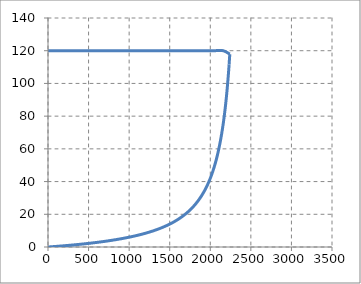
| Category | Series 0 |
|---|---|
| 0.0 | 120 |
| 120.0 | 120 |
| 240.0 | 120 |
| 360.0 | 120 |
| 480.0 | 120 |
| 600.0 | 120 |
| 720.0 | 120 |
| 840.0 | 120 |
| 960.0 | 120 |
| 1080.0 | 120 |
| 1200.0 | 120 |
| 1320.0 | 120 |
| 1440.0 | 120 |
| 1560.0 | 120 |
| 1680.0 | 120 |
| 1800.0 | 120 |
| 1920.0 | 120 |
| 2040.0 | 120 |
| 2160.0 | 120 |
| 2240.3999999999996 | 117.916 |
| 2232.0 | 111.6 |
| 2223.6 | 105.886 |
| 2215.2000000000003 | 100.691 |
| 2206.8 | 95.948 |
| 2198.3999999999996 | 91.6 |
| 2190.0 | 87.6 |
| 2181.6 | 83.908 |
| 2173.2000000000003 | 80.489 |
| 2164.8 | 77.314 |
| 2156.4 | 74.359 |
| 2148.0 | 71.6 |
| 2139.6 | 69.019 |
| 2131.2 | 66.6 |
| 2122.7999999999997 | 64.327 |
| 2114.4 | 62.188 |
| 2105.9999999999995 | 60.171 |
| 2097.6 | 58.267 |
| 2089.2 | 56.465 |
| 2080.7999999999997 | 54.758 |
| 2072.3999999999996 | 53.138 |
| 2064.0 | 51.6 |
| 2055.6 | 50.137 |
| 2047.1999999999998 | 48.743 |
| 2038.7999999999997 | 47.414 |
| 2030.4 | 46.145 |
| 2021.9999999999998 | 44.933 |
| 2013.6 | 43.774 |
| 2005.1999999999996 | 42.664 |
| 1996.7999999999997 | 41.6 |
| 1988.3999999999996 | 40.58 |
| 1980.0 | 39.6 |
| 1971.6 | 38.659 |
| 1963.2 | 37.754 |
| 1954.8 | 36.883 |
| 1946.3999999999996 | 36.044 |
| 1938.0 | 35.236 |
| 1929.6 | 34.457 |
| 1921.1999999999998 | 33.705 |
| 1912.7999999999997 | 32.979 |
| 1904.4 | 32.278 |
| 1895.9999999999998 | 31.6 |
| 1887.5999999999997 | 30.944 |
| 1879.2 | 30.31 |
| 1870.8 | 29.695 |
| 1862.3999999999999 | 29.1 |
| 1853.9999999999998 | 28.523 |
| 1845.6000000000001 | 27.964 |
| 1837.1999999999998 | 27.421 |
| 1828.8 | 26.894 |
| 1820.3999999999996 | 26.383 |
| 1811.9999999999998 | 25.886 |
| 1803.6 | 25.403 |
| 1795.1999999999998 | 24.933 |
| 1786.7999999999997 | 24.477 |
| 1778.3999999999999 | 24.032 |
| 1770.0 | 23.6 |
| 1761.5999999999997 | 23.179 |
| 1753.1999999999998 | 22.769 |
| 1744.8 | 22.369 |
| 1736.4 | 21.98 |
| 1727.9999999999998 | 21.6 |
| 1719.6 | 21.23 |
| 1711.1999999999996 | 20.868 |
| 1702.8000000000002 | 20.516 |
| 1694.3999999999999 | 20.171 |
| 1686.0 | 19.835 |
| 1677.6 | 19.507 |
| 1669.2 | 19.186 |
| 1660.7999999999995 | 18.873 |
| 1652.4 | 18.566 |
| 1644.0 | 18.267 |
| 1635.6 | 17.974 |
| 1627.1999999999996 | 17.687 |
| 1618.7999999999997 | 17.406 |
| 1610.3999999999999 | 17.132 |
| 1601.9999999999998 | 16.863 |
| 1593.6 | 16.6 |
| 1585.1999999999998 | 16.342 |
| 1576.8 | 16.09 |
| 1568.3999999999999 | 15.842 |
| 1559.9999999999995 | 15.6 |
| 1551.6 | 15.362 |
| 1543.2 | 15.129 |
| 1534.7999999999997 | 14.901 |
| 1526.3999999999999 | 14.677 |
| 1518.0 | 14.457 |
| 1509.6 | 14.242 |
| 1501.1999999999998 | 14.03 |
| 1492.8 | 13.822 |
| 1484.4 | 13.618 |
| 1476.0 | 13.418 |
| 1467.5999999999997 | 13.222 |
| 1459.1999999999998 | 13.029 |
| 1450.8 | 12.839 |
| 1442.3999999999999 | 12.653 |
| 1433.9999999999998 | 12.47 |
| 1425.6 | 12.29 |
| 1417.2 | 12.113 |
| 1408.8 | 11.939 |
| 1400.3999999999999 | 11.768 |
| 1392.0 | 11.6 |
| 1383.6 | 11.435 |
| 1375.1999999999998 | 11.272 |
| 1366.8000000000002 | 11.112 |
| 1358.4 | 10.955 |
| 1349.9999999999998 | 10.8 |
| 1341.6 | 10.648 |
| 1333.2 | 10.498 |
| 1324.8 | 10.35 |
| 1316.4 | 10.205 |
| 1307.9999999999995 | 10.062 |
| 1299.6 | 9.921 |
| 1291.2000000000003 | 9.782 |
| 1282.7999999999997 | 9.645 |
| 1274.3999999999996 | 9.51 |
| 1265.9999999999998 | 9.378 |
| 1257.6000000000001 | 9.247 |
| 1249.1999999999996 | 9.118 |
| 1240.7999999999997 | 8.991 |
| 1232.4 | 8.866 |
| 1223.9999999999998 | 8.743 |
| 1215.6 | 8.621 |
| 1207.2 | 8.501 |
| 1198.7999999999997 | 8.383 |
| 1190.3999999999999 | 8.267 |
| 1181.9999999999995 | 8.152 |
| 1173.6 | 8.038 |
| 1165.2 | 7.927 |
| 1156.8 | 7.816 |
| 1148.4 | 7.707 |
| 1140.0 | 7.6 |
| 1131.6 | 7.494 |
| 1123.2 | 7.389 |
| 1114.8 | 7.286 |
| 1106.3999999999999 | 7.184 |
| 1097.9999999999998 | 7.084 |
| 1089.6 | 6.985 |
| 1081.2 | 6.887 |
| 1072.7999999999997 | 6.79 |
| 1064.3999999999999 | 6.694 |
| 1055.9999999999998 | 6.6 |
| 1047.6 | 6.507 |
| 1039.1999999999998 | 6.415 |
| 1030.8 | 6.324 |
| 1022.3999999999999 | 6.234 |
| 1013.9999999999999 | 6.145 |
| 1005.6 | 6.058 |
| 997.1999999999998 | 5.971 |
| 988.8 | 5.886 |
| 980.3999999999999 | 5.801 |
| 972.0 | 5.718 |
| 963.5999999999998 | 5.635 |
| 955.2 | 5.553 |
| 946.7999999999998 | 5.473 |
| 938.4000000000001 | 5.393 |
| 930.0 | 5.314 |
| 921.6 | 5.236 |
| 913.1999999999998 | 5.159 |
| 904.8000000000001 | 5.083 |
| 896.3999999999997 | 5.008 |
| 888.0 | 4.933 |
| 879.5999999999998 | 4.86 |
| 871.1999999999999 | 4.787 |
| 862.8000000000002 | 4.715 |
| 854.4 | 4.643 |
| 846.0000000000001 | 4.573 |
| 837.5999999999999 | 4.503 |
| 829.1999999999999 | 4.434 |
| 820.7999999999998 | 4.366 |
| 812.4 | 4.298 |
| 803.9999999999998 | 4.232 |
| 795.5999999999999 | 4.165 |
| 787.1999999999999 | 4.1 |
| 778.8000000000001 | 4.035 |
| 770.3999999999999 | 3.971 |
| 761.9999999999999 | 3.908 |
| 753.5999999999998 | 3.845 |
| 745.1999999999999 | 3.783 |
| 736.7999999999998 | 3.721 |
| 728.4 | 3.66 |
| 719.9999999999998 | 3.6 |
| 711.5999999999999 | 3.54 |
| 703.2 | 3.481 |
| 694.8 | 3.423 |
| 686.4 | 3.365 |
| 677.9999999999999 | 3.307 |
| 669.6 | 3.25 |
| 661.1999999999999 | 3.194 |
| 652.8000000000001 | 3.138 |
| 644.3999999999999 | 3.083 |
| 636.0000000000001 | 3.029 |
| 627.5999999999999 | 2.974 |
| 619.1999999999999 | 2.921 |
| 610.7999999999998 | 2.868 |
| 602.4 | 2.815 |
| 593.9999999999998 | 2.763 |
| 585.5999999999999 | 2.711 |
| 577.1999999999998 | 2.66 |
| 568.8 | 2.609 |
| 560.3999999999997 | 2.559 |
| 551.9999999999999 | 2.509 |
| 543.6 | 2.46 |
| 535.1999999999998 | 2.411 |
| 526.8000000000001 | 2.362 |
| 518.4 | 2.314 |
| 510.0000000000001 | 2.267 |
| 501.5999999999999 | 2.219 |
| 493.20000000000005 | 2.173 |
| 484.7999999999999 | 2.126 |
| 476.40000000000003 | 2.08 |
| 467.99999999999983 | 2.035 |
| 459.6 | 1.99 |
| 451.1999999999998 | 1.945 |
| 442.8 | 1.9 |
| 434.3999999999998 | 1.856 |
| 426.0 | 1.813 |
| 417.5999999999998 | 1.769 |
| 409.19999999999993 | 1.727 |
| 400.80000000000007 | 1.684 |
| 392.3999999999999 | 1.642 |
| 384.0 | 1.6 |
| 375.59999999999997 | 1.559 |
| 367.2000000000001 | 1.517 |
| 358.7999999999999 | 1.477 |
| 350.4 | 1.436 |
| 341.9999999999999 | 1.396 |
| 333.6 | 1.356 |
| 325.19999999999993 | 1.317 |
| 316.79999999999995 | 1.277 |
| 308.39999999999986 | 1.239 |
| 300.0 | 1.2 |
| 291.59999999999985 | 1.162 |
| 283.19999999999993 | 1.124 |
| 274.79999999999984 | 1.086 |
| 266.3999999999999 | 1.049 |
| 257.99999999999983 | 1.012 |
| 249.59999999999994 | 0.975 |
| 241.20000000000007 | 0.939 |
| 232.79999999999993 | 0.902 |
| 224.40000000000006 | 0.866 |
| 215.9999999999999 | 0.831 |
| 207.60000000000002 | 0.795 |
| 199.1999999999999 | 0.76 |
| 190.80000000000004 | 0.725 |
| 182.3999999999999 | 0.691 |
| 174.0 | 0.657 |
| 165.59999999999988 | 0.623 |
| 157.20000000000002 | 0.589 |
| 148.79999999999987 | 0.555 |
| 140.39999999999998 | 0.522 |
| 131.99999999999986 | 0.489 |
| 123.59999999999997 | 0.456 |
| 115.19999999999982 | 0.424 |
| 106.79999999999995 | 0.391 |
| 98.39999999999982 | 0.359 |
| 89.99999999999994 | 0.327 |
| 81.60000000000007 | 0.296 |
| 73.19999999999992 | 0.264 |
| 64.80000000000005 | 0.233 |
| 56.399999999999906 | 0.202 |
| 48.00000000000004 | 0.171 |
| 39.5999999999999 | 0.141 |
| 31.200000000000028 | 0.111 |
| 22.799999999999883 | 0.081 |
| 14.400000000000013 | 0.051 |
| 5.999999999999871 | 0.021 |
| 0.0 | 0 |
| 0.0 | 0 |
| 0.0 | 0 |
| 0.0 | 0 |
| 0.0 | 0 |
| 0.0 | 0 |
| 0.0 | 0 |
| 0.0 | 0 |
| 0.0 | 0 |
| 0.0 | 0 |
| 0.0 | 0 |
| 0.0 | 0 |
| 0.0 | 0 |
| 0.0 | 0 |
| 0.0 | 0 |